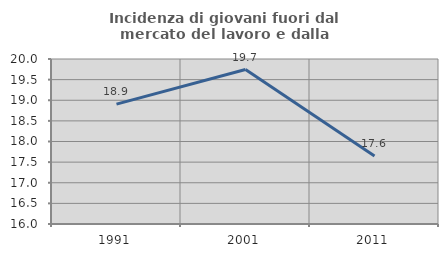
| Category | Incidenza di giovani fuori dal mercato del lavoro e dalla formazione  |
|---|---|
| 1991.0 | 18.905 |
| 2001.0 | 19.744 |
| 2011.0 | 17.647 |